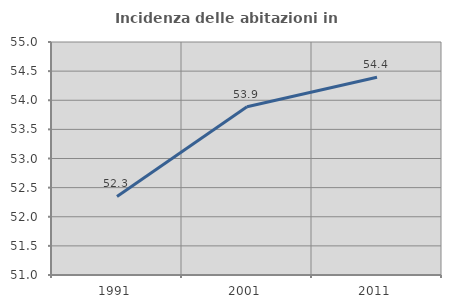
| Category | Incidenza delle abitazioni in proprietà  |
|---|---|
| 1991.0 | 52.349 |
| 2001.0 | 53.889 |
| 2011.0 | 54.395 |